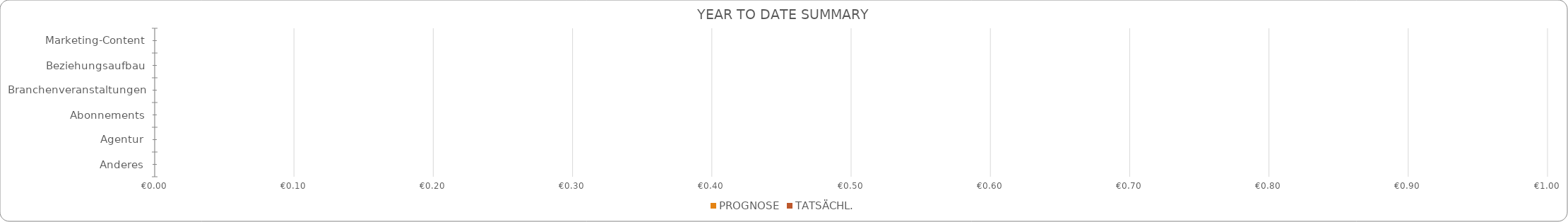
| Category | PROGNOSE | TATSÄCHL. |
|---|---|---|
| Marketing-Content | 0 | 0 |
| Beziehungsaufbau | 0 | 0 |
| Branchenveranstaltungen | 0 | 0 |
| Abonnements | 0 | 0 |
| Agentur | 0 | 0 |
| Anderes | 0 | 0 |